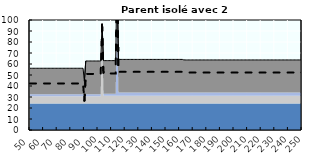
| Category | Coin fiscal marginal (somme des composantes) | Taux d’imposition marginal net |
|---|---|---|
| 50.0 | 56.131 | 42.277 |
| 51.0 | 56.131 | 42.277 |
| 52.0 | 56.131 | 42.277 |
| 53.0 | 56.131 | 42.277 |
| 54.0 | 56.131 | 42.277 |
| 55.0 | 56.131 | 42.277 |
| 56.0 | 56.131 | 42.277 |
| 57.0 | 56.131 | 42.277 |
| 58.0 | 56.131 | 42.277 |
| 59.0 | 56.131 | 42.277 |
| 60.0 | 56.131 | 42.277 |
| 61.0 | 56.131 | 42.277 |
| 62.0 | 56.131 | 42.277 |
| 63.0 | 56.131 | 42.277 |
| 64.0 | 56.131 | 42.277 |
| 65.0 | 56.131 | 42.277 |
| 66.0 | 56.131 | 42.277 |
| 67.0 | 56.131 | 42.277 |
| 68.0 | 56.131 | 42.277 |
| 69.0 | 56.131 | 42.277 |
| 70.0 | 56.131 | 42.277 |
| 71.0 | 56.131 | 42.277 |
| 72.0 | 56.131 | 42.277 |
| 73.0 | 56.131 | 42.277 |
| 74.0 | 56.131 | 42.277 |
| 75.0 | 56.131 | 42.277 |
| 76.0 | 56.131 | 42.277 |
| 77.0 | 56.131 | 42.277 |
| 78.0 | 56.131 | 42.277 |
| 79.0 | 56.131 | 42.277 |
| 80.0 | 56.131 | 42.277 |
| 81.0 | 56.131 | 42.277 |
| 82.0 | 56.131 | 42.277 |
| 83.0 | 56.131 | 42.277 |
| 84.0 | 56.131 | 42.277 |
| 85.0 | 56.131 | 42.277 |
| 86.0 | 56.131 | 42.277 |
| 87.0 | 56.131 | 42.277 |
| 88.0 | 56.131 | 42.277 |
| 89.0 | 56.131 | 42.277 |
| 90.0 | 44.333 | 26.753 |
| 91.0 | 62.743 | 50.977 |
| 92.0 | 62.743 | 50.977 |
| 93.0 | 62.743 | 50.977 |
| 94.0 | 62.743 | 50.977 |
| 95.0 | 62.743 | 50.977 |
| 96.0 | 62.743 | 50.977 |
| 97.0 | 62.743 | 50.977 |
| 98.0 | 62.743 | 50.977 |
| 99.0 | 62.743 | 50.977 |
| 100.0 | 62.743 | 50.977 |
| 101.0 | 62.743 | 50.977 |
| 102.0 | 62.743 | 50.977 |
| 103.0 | 96.691 | 95.646 |
| 104.0 | 63.069 | 51.407 |
| 105.0 | 63.069 | 51.407 |
| 106.0 | 63.069 | 51.407 |
| 107.0 | 63.069 | 51.407 |
| 108.0 | 63.069 | 51.407 |
| 109.0 | 63.069 | 51.407 |
| 110.0 | 63.069 | 51.407 |
| 111.0 | 63.069 | 51.407 |
| 112.0 | 63.069 | 51.407 |
| 113.0 | 63.069 | 51.407 |
| 114.0 | 150.352 | 166.254 |
| 115.0 | 64.17 | 52.855 |
| 116.0 | 64.17 | 52.855 |
| 117.0 | 64.17 | 52.855 |
| 118.0 | 64.17 | 52.855 |
| 119.0 | 64.17 | 52.855 |
| 120.0 | 64.17 | 52.855 |
| 121.0 | 64.17 | 52.855 |
| 122.0 | 64.17 | 52.855 |
| 123.0 | 64.17 | 52.855 |
| 124.0 | 64.17 | 52.855 |
| 125.0 | 64.17 | 52.855 |
| 126.0 | 64.17 | 52.855 |
| 127.0 | 64.17 | 52.855 |
| 128.0 | 64.17 | 52.855 |
| 129.0 | 64.17 | 52.855 |
| 130.0 | 64.17 | 52.855 |
| 131.0 | 64.17 | 52.855 |
| 132.0 | 64.17 | 52.855 |
| 133.0 | 64.17 | 52.855 |
| 134.0 | 64.17 | 52.855 |
| 135.0 | 64.17 | 52.855 |
| 136.0 | 64.17 | 52.855 |
| 137.0 | 64.17 | 52.855 |
| 138.0 | 64.17 | 52.855 |
| 139.0 | 64.17 | 52.855 |
| 140.0 | 64.17 | 52.855 |
| 141.0 | 64.17 | 52.855 |
| 142.0 | 64.17 | 52.855 |
| 143.0 | 64.17 | 52.855 |
| 144.0 | 64.17 | 52.855 |
| 145.0 | 64.17 | 52.855 |
| 146.0 | 64.17 | 52.855 |
| 147.0 | 64.17 | 52.855 |
| 148.0 | 64.17 | 52.855 |
| 149.0 | 64.17 | 52.855 |
| 150.0 | 64.17 | 52.855 |
| 151.0 | 64.17 | 52.855 |
| 152.0 | 64.17 | 52.855 |
| 153.0 | 64.17 | 52.855 |
| 154.0 | 64.17 | 52.855 |
| 155.0 | 64.17 | 52.855 |
| 156.0 | 64.17 | 52.855 |
| 157.0 | 64.17 | 52.855 |
| 158.0 | 64.17 | 52.855 |
| 159.0 | 64.17 | 52.855 |
| 160.0 | 64.17 | 52.855 |
| 161.0 | 64.17 | 52.855 |
| 162.0 | 64.17 | 52.855 |
| 163.0 | 63.783 | 52.346 |
| 164.0 | 63.701 | 52.238 |
| 165.0 | 63.701 | 52.238 |
| 166.0 | 63.701 | 52.238 |
| 167.0 | 63.701 | 52.238 |
| 168.0 | 63.701 | 52.238 |
| 169.0 | 63.701 | 52.238 |
| 170.0 | 63.701 | 52.238 |
| 171.0 | 63.701 | 52.238 |
| 172.0 | 63.701 | 52.238 |
| 173.0 | 63.701 | 52.238 |
| 174.0 | 63.701 | 52.238 |
| 175.0 | 63.701 | 52.238 |
| 176.0 | 63.701 | 52.238 |
| 177.0 | 63.701 | 52.238 |
| 178.0 | 63.701 | 52.238 |
| 179.0 | 63.701 | 52.238 |
| 180.0 | 63.701 | 52.238 |
| 181.0 | 63.701 | 52.238 |
| 182.0 | 63.701 | 52.238 |
| 183.0 | 63.701 | 52.238 |
| 184.0 | 63.701 | 52.238 |
| 185.0 | 63.701 | 52.238 |
| 186.0 | 63.701 | 52.238 |
| 187.0 | 63.701 | 52.238 |
| 188.0 | 63.701 | 52.238 |
| 189.0 | 63.701 | 52.238 |
| 190.0 | 63.701 | 52.238 |
| 191.0 | 63.701 | 52.238 |
| 192.0 | 63.701 | 52.238 |
| 193.0 | 63.701 | 52.238 |
| 194.0 | 63.701 | 52.238 |
| 195.0 | 63.701 | 52.238 |
| 196.0 | 63.701 | 52.238 |
| 197.0 | 63.701 | 52.238 |
| 198.0 | 63.701 | 52.238 |
| 199.0 | 63.701 | 52.238 |
| 200.0 | 63.701 | 52.238 |
| 201.0 | 63.701 | 52.238 |
| 202.0 | 63.701 | 52.238 |
| 203.0 | 63.701 | 52.238 |
| 204.0 | 63.701 | 52.238 |
| 205.0 | 63.701 | 52.238 |
| 206.0 | 63.701 | 52.238 |
| 207.0 | 63.701 | 52.238 |
| 208.0 | 63.701 | 52.238 |
| 209.0 | 63.701 | 52.238 |
| 210.0 | 63.701 | 52.238 |
| 211.0 | 63.701 | 52.238 |
| 212.0 | 63.701 | 52.238 |
| 213.0 | 63.701 | 52.238 |
| 214.0 | 63.701 | 52.238 |
| 215.0 | 63.701 | 52.238 |
| 216.0 | 63.701 | 52.238 |
| 217.0 | 63.701 | 52.238 |
| 218.0 | 63.701 | 52.238 |
| 219.0 | 63.701 | 52.238 |
| 220.0 | 63.701 | 52.238 |
| 221.0 | 63.701 | 52.238 |
| 222.0 | 63.701 | 52.238 |
| 223.0 | 63.701 | 52.238 |
| 224.0 | 63.701 | 52.238 |
| 225.0 | 63.701 | 52.238 |
| 226.0 | 63.701 | 52.238 |
| 227.0 | 63.701 | 52.238 |
| 228.0 | 63.701 | 52.238 |
| 229.0 | 63.701 | 52.238 |
| 230.0 | 63.701 | 52.238 |
| 231.0 | 63.701 | 52.238 |
| 232.0 | 63.701 | 52.238 |
| 233.0 | 63.701 | 52.238 |
| 234.0 | 63.701 | 52.238 |
| 235.0 | 63.701 | 52.238 |
| 236.0 | 63.701 | 52.238 |
| 237.0 | 63.701 | 52.238 |
| 238.0 | 63.701 | 52.238 |
| 239.0 | 63.701 | 52.238 |
| 240.0 | 63.701 | 52.238 |
| 241.0 | 63.701 | 52.238 |
| 242.0 | 63.701 | 52.238 |
| 243.0 | 63.701 | 52.238 |
| 244.0 | 63.701 | 52.238 |
| 245.0 | 63.701 | 52.238 |
| 246.0 | 63.701 | 52.238 |
| 247.0 | 63.701 | 52.238 |
| 248.0 | 63.701 | 52.238 |
| 249.0 | 63.701 | 52.238 |
| 250.0 | 63.701 | 52.238 |